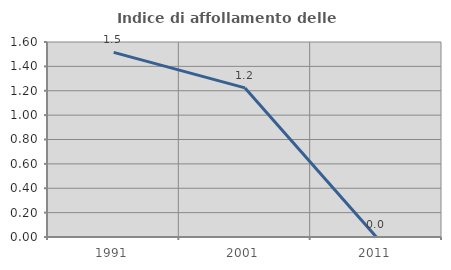
| Category | Indice di affollamento delle abitazioni  |
|---|---|
| 1991.0 | 1.515 |
| 2001.0 | 1.223 |
| 2011.0 | 0 |